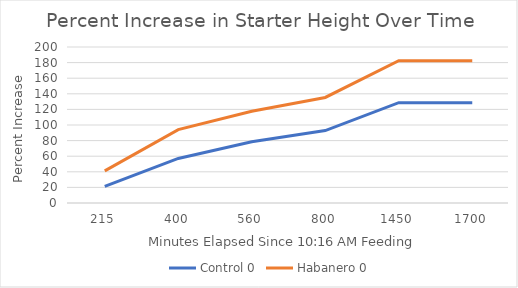
| Category | Control | Habanero |
|---|---|---|
| 215.0 | 21.43 | 41.18 |
| 400.0 | 57.14 | 94.12 |
| 560.0 | 78.57 | 117.7 |
| 800.0 | 92.86 | 135.3 |
| 1450.0 | 128.6 | 182.4 |
| 1700.0 | 128.6 | 182.4 |